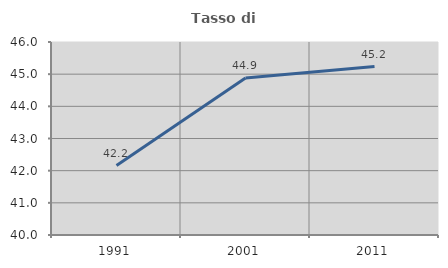
| Category | Tasso di occupazione   |
|---|---|
| 1991.0 | 42.158 |
| 2001.0 | 44.879 |
| 2011.0 | 45.237 |